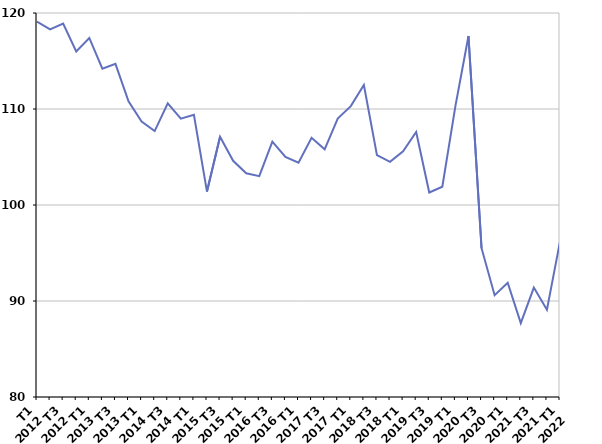
| Category | Fin de contrat |
|---|---|
| T1
2012 | 119.1 |
| T2
2012 | 118.3 |
| T3
2012 | 118.9 |
| T4
2012 | 116 |
| T1
2013 | 117.4 |
| T2
2013 | 114.2 |
| T3
2013 | 114.7 |
| T4
2013 | 110.8 |
| T1
2014 | 108.7 |
| T2
2014 | 107.7 |
| T3
2014 | 110.6 |
| T4
2014 | 109 |
| T1
2015 | 109.4 |
| T2
2015 | 101.4 |
| T3
2015 | 107.1 |
| T4
2015 | 104.6 |
| T1
2016 | 103.3 |
| T2
2016 | 103 |
| T3
2016 | 106.6 |
| T4
2016 | 105 |
| T1
2017 | 104.4 |
| T2
2017 | 107 |
| T3
2017 | 105.8 |
| T4
2017 | 109 |
| T1
2018 | 110.3 |
| T2
2018 | 112.5 |
| T3
2018 | 105.2 |
| T4
2018 | 104.5 |
| T1
2019 | 105.6 |
| T2
2019 | 107.6 |
| T3
2019 | 101.3 |
| T4
2019 | 101.9 |
| T1
2020 | 110.3 |
| T2
2020 | 117.6 |
| T3
2020 | 95.5 |
| T4
2020 | 90.6 |
| T1
2021 | 91.9 |
| T2
2021 | 87.7 |
| T3
2021 | 91.4 |
| T4
2021 | 89.1 |
| T1
2022 | 96.2 |